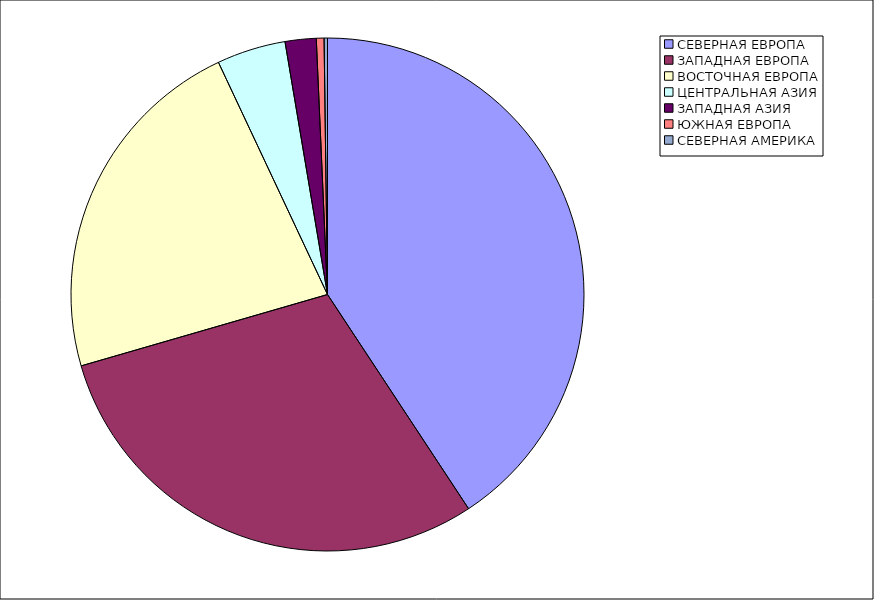
| Category | Оборот |
|---|---|
| СЕВЕРНАЯ ЕВРОПА | 40.73 |
| ЗАПАДНАЯ ЕВРОПА | 29.78 |
| ВОСТОЧНАЯ ЕВРОПА | 22.499 |
| ЦЕНТРАЛЬНАЯ АЗИЯ | 4.339 |
| ЗАПАДНАЯ АЗИЯ | 1.953 |
| ЮЖНАЯ ЕВРОПА | 0.485 |
| СЕВЕРНАЯ АМЕРИКА | 0.213 |